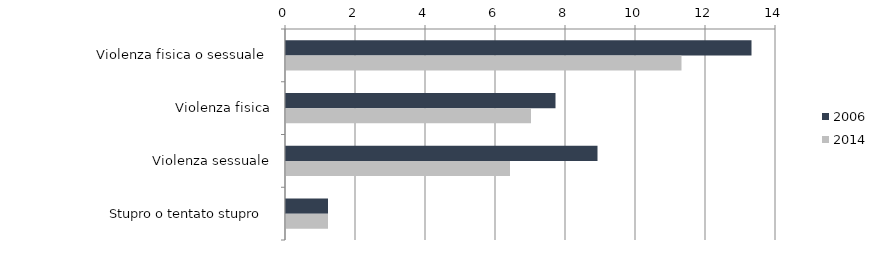
| Category | 2006 | 2014 |
|---|---|---|
| Violenza fisica o sessuale  | 13.3 | 11.3 |
| Violenza fisica | 7.7 | 7 |
| Violenza sessuale | 8.9 | 6.4 |
| Stupro o tentato stupro  | 1.2 | 1.2 |